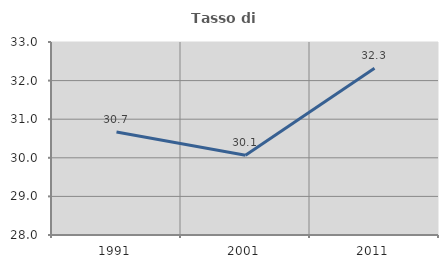
| Category | Tasso di occupazione   |
|---|---|
| 1991.0 | 30.667 |
| 2001.0 | 30.064 |
| 2011.0 | 32.317 |